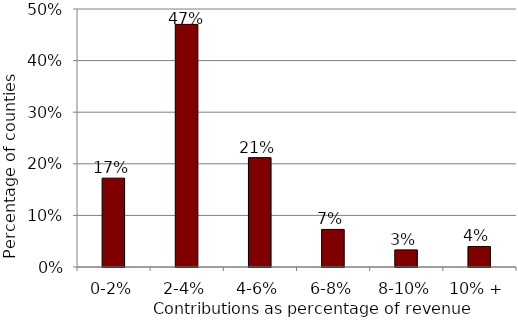
| Category | Series 0 |
|---|---|
| 0-2% | 0.172 |
| 2-4% | 0.47 |
| 4-6% | 0.212 |
| 6-8% | 0.073 |
| 8-10% | 0.033 |
| 10% + | 0.04 |